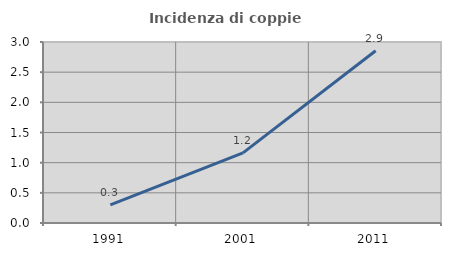
| Category | Incidenza di coppie miste |
|---|---|
| 1991.0 | 0.299 |
| 2001.0 | 1.162 |
| 2011.0 | 2.855 |